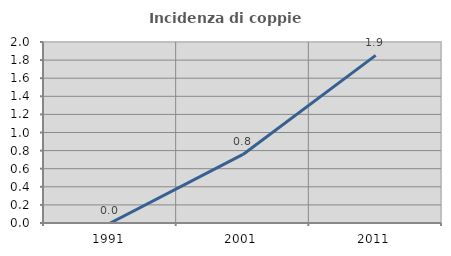
| Category | Incidenza di coppie miste |
|---|---|
| 1991.0 | 0 |
| 2001.0 | 0.758 |
| 2011.0 | 1.852 |